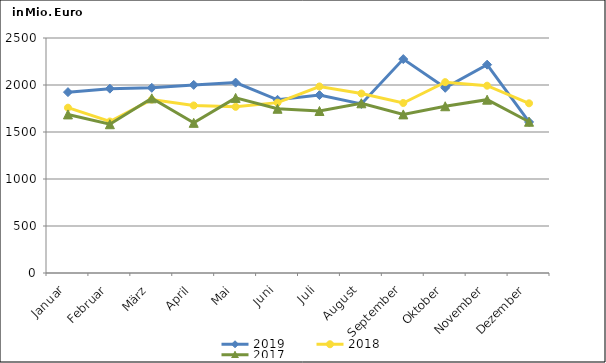
| Category | 2019 | 2018 | 2017 |
|---|---|---|---|
| Januar | 1924.087 | 1758.692 | 1687.048 |
| Februar | 1960.978 | 1611.697 | 1582.678 |
| März | 1969.971 | 1844.551 | 1858.326 |
| April | 2001.011 | 1782.309 | 1597.556 |
| Mai | 2025.3 | 1767.755 | 1862.56 |
| Juni | 1842.571 | 1812.405 | 1747.243 |
| Juli | 1892.559 | 1984.258 | 1723.336 |
| August | 1798.539 | 1909.185 | 1805.426 |
| September | 2275.625 | 1808.633 | 1687.333 |
| Oktober | 1970.196 | 2030.236 | 1773.986 |
| November | 2216.347 | 1992.673 | 1843.798 |
| Dezember | 1606.787 | 1805.128 | 1609.054 |